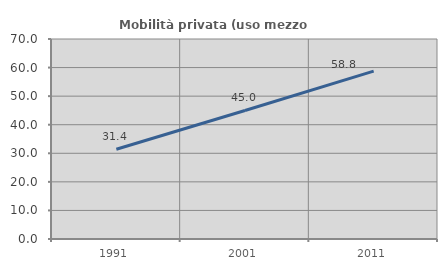
| Category | Mobilità privata (uso mezzo privato) |
|---|---|
| 1991.0 | 31.395 |
| 2001.0 | 44.991 |
| 2011.0 | 58.758 |